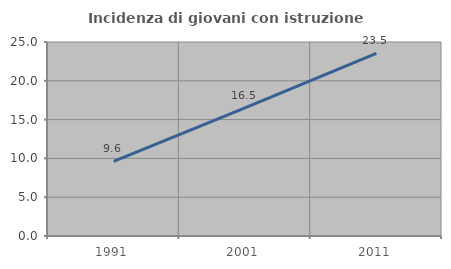
| Category | Incidenza di giovani con istruzione universitaria |
|---|---|
| 1991.0 | 9.615 |
| 2001.0 | 16.517 |
| 2011.0 | 23.529 |